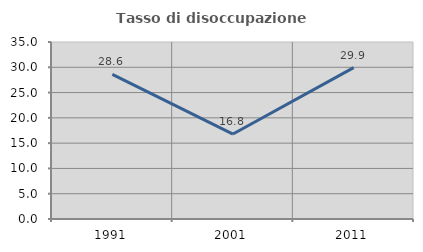
| Category | Tasso di disoccupazione giovanile  |
|---|---|
| 1991.0 | 28.605 |
| 2001.0 | 16.797 |
| 2011.0 | 29.944 |